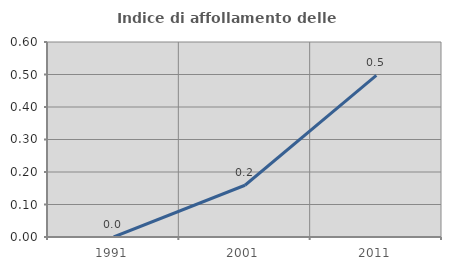
| Category | Indice di affollamento delle abitazioni  |
|---|---|
| 1991.0 | 0 |
| 2001.0 | 0.159 |
| 2011.0 | 0.498 |